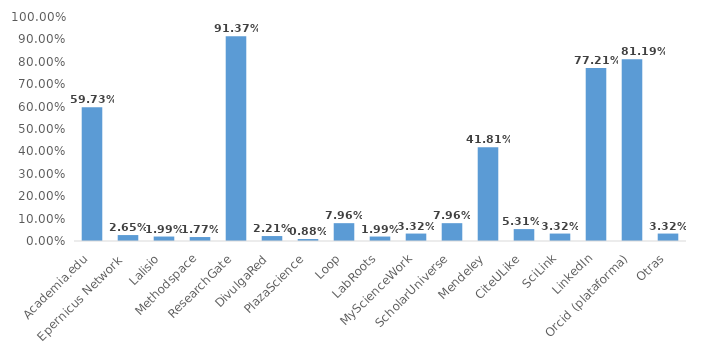
| Category | Series 0 |
|---|---|
| Academia.edu | 0.597 |
| Epernicus Network  | 0.026 |
| Lalisio | 0.02 |
| Methodspace | 0.018 |
| ResearchGate | 0.914 |
| DivulgaRed | 0.022 |
| PlazaScience | 0.009 |
| Loop | 0.08 |
| LabRoots | 0.02 |
| MyScienceWork | 0.033 |
| ScholarUniverse | 0.08 |
| Mendeley | 0.418 |
| CiteULike | 0.053 |
| SciLink | 0.033 |
| LinkedIn | 0.772 |
| Orcid (plataforma) | 0.812 |
| Otras | 0.033 |